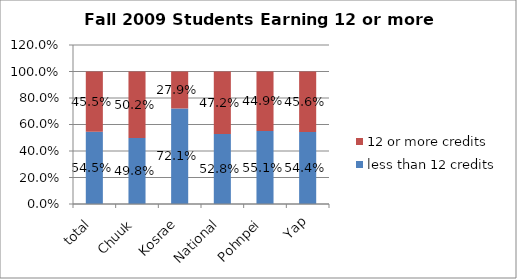
| Category | less than 12 credits | 12 or more credits |
|---|---|---|
| total | 0.545 | 0.455 |
| Chuuk | 0.498 | 0.502 |
| Kosrae | 0.721 | 0.279 |
| National | 0.528 | 0.472 |
| Pohnpei | 0.551 | 0.449 |
| Yap | 0.544 | 0.456 |